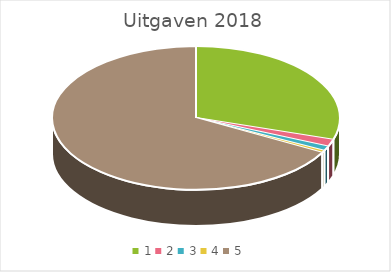
| Category | Series 0 |
|---|---|
| 0 | 775 |
| 1 | 190 |
| 2 | 72 |
| 3 | 60 |
| 4 | 6200 |